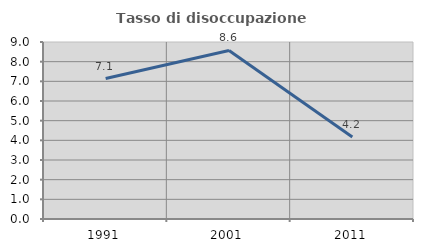
| Category | Tasso di disoccupazione giovanile  |
|---|---|
| 1991.0 | 7.143 |
| 2001.0 | 8.571 |
| 2011.0 | 4.167 |